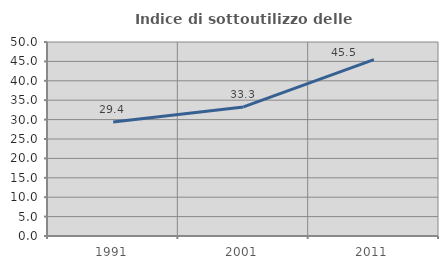
| Category | Indice di sottoutilizzo delle abitazioni  |
|---|---|
| 1991.0 | 29.356 |
| 2001.0 | 33.271 |
| 2011.0 | 45.455 |